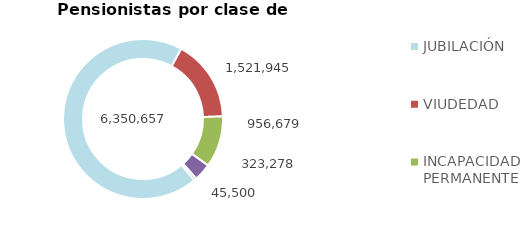
| Category | Series 0 |
|---|---|
| JUBILACIÓN | 6350657 |
| VIUDEDAD | 1521945 |
| INCAPACIDAD PERMANENTE | 956679 |
| ORFANDAD | 323278 |
| FAVOR DE FAMILIARES | 45500 |